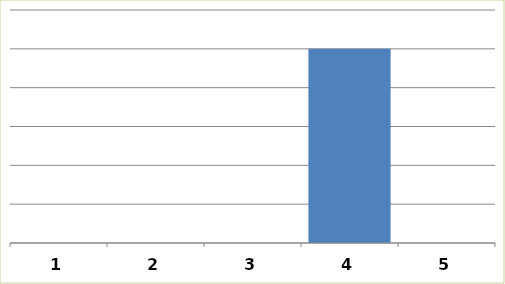
| Category | Series 0 |
|---|---|
| 0 | 0 |
| 1 | 0 |
| 2 | 0 |
| 3 | 5000 |
| 4 | 0 |